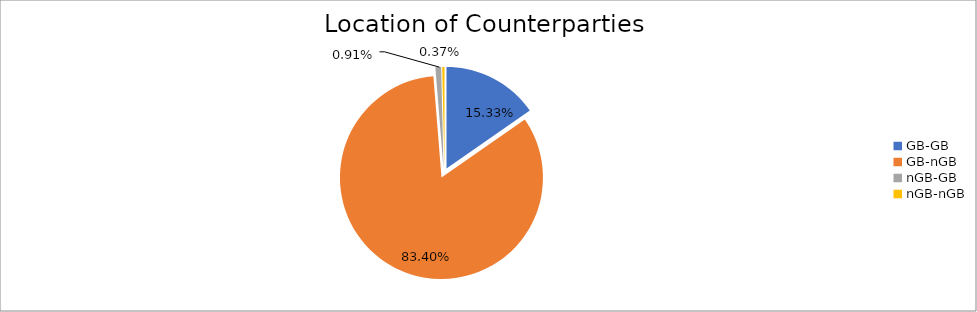
| Category | Series 0 |
|---|---|
| GB-GB | 1489747.319 |
| GB-nGB | 8106148.107 |
| nGB-GB | 88667.862 |
| nGB-nGB | 35507.015 |